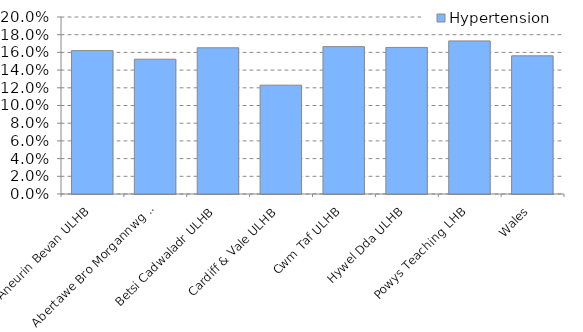
| Category | Hypertension |
|---|---|
| Aneurin Bevan ULHB | 0.162 |
| Abertawe Bro Morgannwg ULHB | 0.152 |
| Betsi Cadwaladr ULHB | 0.165 |
| Cardiff & Vale ULHB | 0.123 |
| Cwm Taf ULHB | 0.167 |
| Hywel Dda ULHB | 0.166 |
| Powys Teaching LHB | 0.173 |
| Wales | 0.156 |